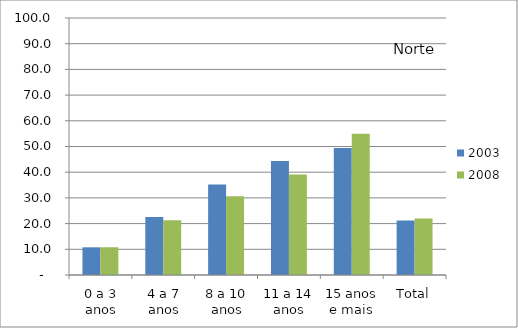
| Category | 2003 | 2008 |
|---|---|---|
| 0 a 3 anos | 10.77 | 10.79 |
| 4 a 7 anos | 22.55 | 21.27 |
| 8 a 10 anos | 35.25 | 30.67 |
| 11 a 14 anos | 44.34 | 39.06 |
| 15 anos e mais | 49.44 | 54.92 |
| Total | 21.17 | 21.94 |